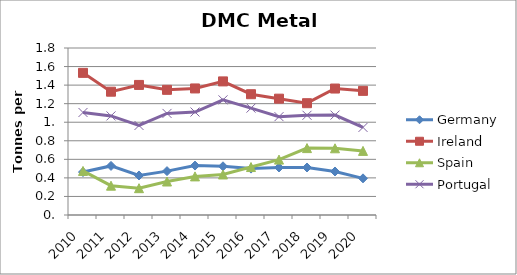
| Category | Germany | Ireland | Spain | Portugal |
|---|---|---|---|---|
| 2010 | 0.463 | 1.532 | 0.475 | 1.105 |
| 2011 | 0.529 | 1.329 | 0.316 | 1.068 |
| 2012 | 0.426 | 1.402 | 0.289 | 0.965 |
| 2013 | 0.473 | 1.349 | 0.361 | 1.095 |
| 2014 | 0.533 | 1.364 | 0.416 | 1.11 |
| 2015 | 0.525 | 1.44 | 0.437 | 1.241 |
| 2016 | 0.5 | 1.302 | 0.517 | 1.152 |
| 2017 | 0.512 | 1.254 | 0.597 | 1.06 |
| 2018 | 0.512 | 1.205 | 0.721 | 1.075 |
| 2019 | 0.469 | 1.363 | 0.719 | 1.077 |
| 2020 | 0.395 | 1.338 | 0.691 | 0.944 |